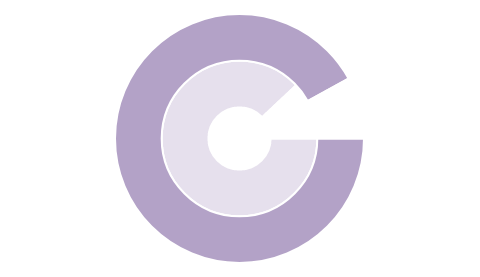
| Category | Series 1 | Series 0 |
|---|---|---|
| 0 | 0.88 | 0.92 |
| 1 | 0.12 | 0.08 |